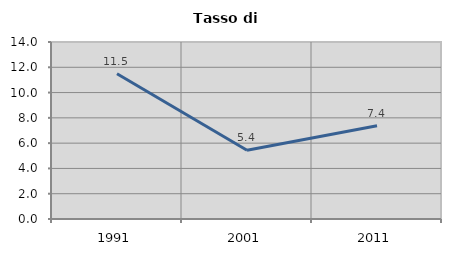
| Category | Tasso di disoccupazione   |
|---|---|
| 1991.0 | 11.491 |
| 2001.0 | 5.442 |
| 2011.0 | 7.374 |